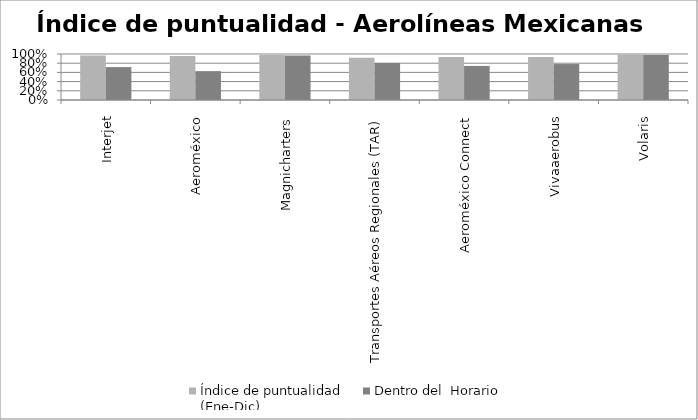
| Category | Índice de puntualidad
(Ene-Dic) | Dentro del  Horario |
|---|---|---|
| Interjet | 0.967 | 0.715 |
| Aeroméxico | 0.959 | 0.627 |
| Magnicharters | 0.981 | 0.969 |
| Transportes Aéreos Regionales (TAR) | 0.917 | 0.805 |
| Aeroméxico Connect | 0.933 | 0.74 |
| Vivaaerobus | 0.937 | 0.782 |
| Volaris | 0.99 | 0.977 |